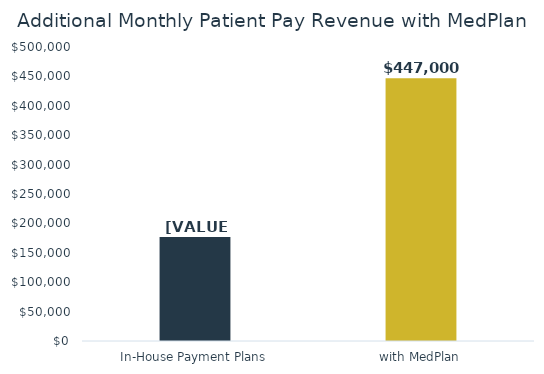
| Category | Additional Monthly Patient Pay Revenue with MedPlan |
|---|---|
| In-House Payment Plans | 176708.548 |
| with MedPlan | 447000 |